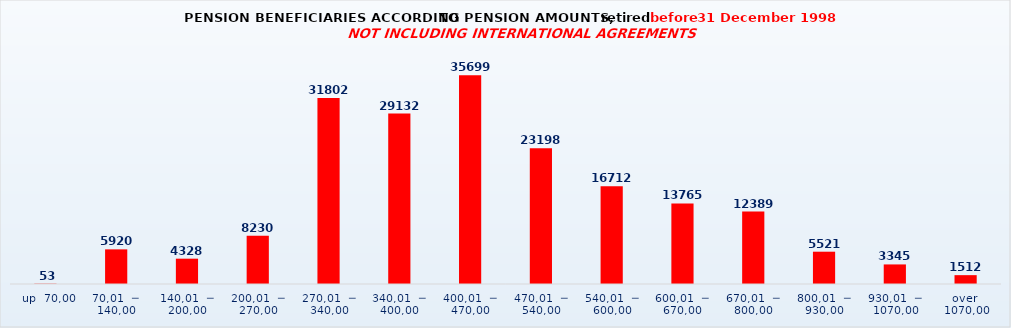
| Category | Series 0 |
|---|---|
|   up  70,00 | 53 |
| 70,01  ─  140,00 | 5920 |
| 140,01  ─  200,00 | 4328 |
| 200,01  ─  270,00 | 8230 |
| 270,01  ─  340,00 | 31802 |
| 340,01  ─  400,00 | 29132 |
| 400,01  ─  470,00 | 35699 |
| 470,01  ─  540,00 | 23198 |
| 540,01  ─  600,00 | 16712 |
| 600,01  ─  670,00 | 13765 |
| 670,01  ─  800,00 | 12389 |
| 800,01  ─  930,00 | 5521 |
| 930,01  ─  1070,00 | 3345 |
| over  1070,00 | 1512 |